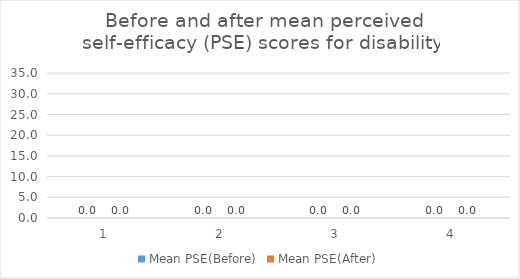
| Category | Mean PSE(Before) | Mean PSE(After) |
|---|---|---|
| 0 | 0 | 0 |
| 1 | 0 | 0 |
| 2 | 0 | 0 |
| 3 | 0 | 0 |